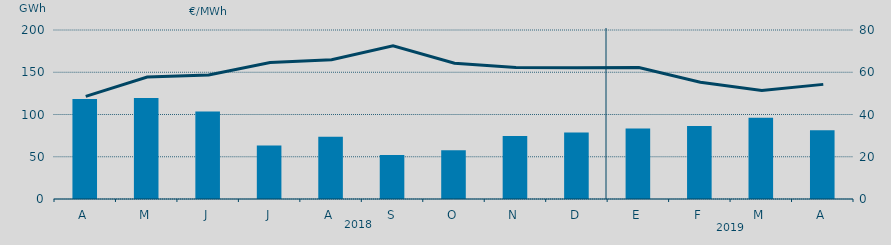
| Category | Energía a subir |
|---|---|
| A | 118.38 |
| M | 119.519 |
| J | 103.599 |
| J | 63.222 |
| A | 73.63 |
| S | 52.192 |
| O | 57.766 |
| N | 74.612 |
| D | 78.584 |
| E | 83.556 |
| F | 86.305 |
| M | 96.139 |
| A | 81.387 |